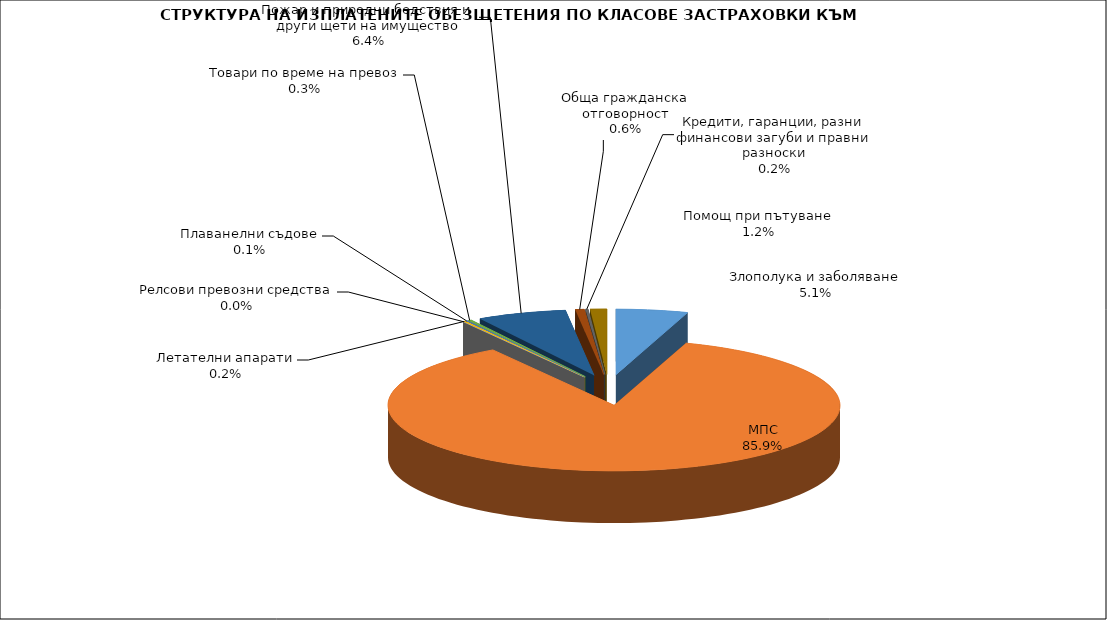
| Category | Series 0 |
|---|---|
| Злополука и заболяване | 0.051 |
| МПС | 0.859 |
| Релсови превозни средства | 0 |
| Летателни апарати | 0.002 |
| Плаванелни съдове | 0.001 |
| Товари по време на превоз | 0.003 |
| Пожар и природни бедствия и други щети на имущество | 0.064 |
| Обща гражданска отговорност | 0.006 |
| Кредити, гаранции, разни финансови загуби и правни разноски | 0.002 |
| Помощ при пътуване | 0.012 |